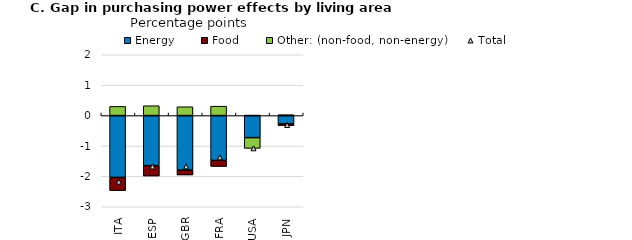
| Category | Energy | Food | Other: (non-food, non-energy) |
|---|---|---|---|
| ITA | -2.034 | -0.434 | 0.302 |
| ESP | -1.647 | -0.341 | 0.323 |
| GBR | -1.796 | -0.158 | 0.29 |
| FRA | -1.475 | -0.199 | 0.308 |
| USA | -0.726 | 0.011 | -0.354 |
| JPN | -0.276 | -0.054 | 0.027 |